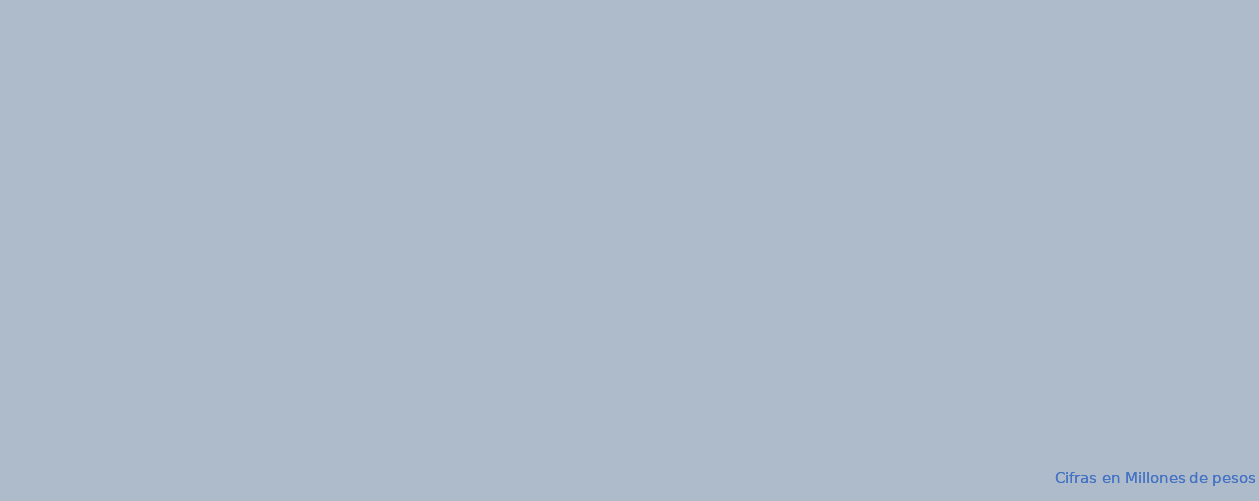
| Category | APROPIACION | COMPROMISOS |  OBLIGACIONES |  PAGOS |
|---|---|---|---|---|
| A-FUNCIONAMIENTO | 99785.985 | 49170.519 | 44561.386 | 43321.506 |
| B-SERVICIO DE LA DEUDA PÚBLICA | 1167604.335 | 697064.472 | 697064.472 | 697064.472 |
| C- INVERSION | 4505182.025 | 4344034.061 | 358063.886 | 357678.27 |